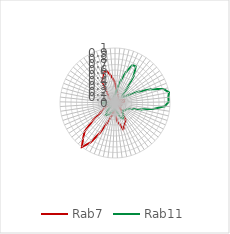
| Category | Rab7 | Rab11 |
|---|---|---|
| 0.0 | 0.37 | 0.139 |
| 0.10913 | 0.261 | 0.195 |
| 0.21825 | 0.221 | 0.298 |
| 0.32738 | 0.175 | 0.433 |
| 0.43651 | 0.157 | 0.603 |
| 0.54563 | 0.128 | 0.759 |
| 0.65476 | 0.121 | 0.767 |
| 0.76389 | 0.085 | 0.602 |
| 0.87302 | 0.066 | 0.363 |
| 0.98214 | 0.097 | 0.198 |
| 1.09127 | 0.088 | 0.164 |
| 1.2004 | 0.059 | 0.194 |
| 1.30952 | 0.069 | 0.29 |
| 1.41865 | 0.114 | 0.472 |
| 1.52778 | 0.144 | 0.701 |
| 1.6369 | 0.106 | 0.921 |
| 1.74603 | 0.183 | 1 |
| 1.85516 | 0.133 | 0.975 |
| 1.96429 | 0.093 | 0.975 |
| 2.07341 | 0.074 | 0.909 |
| 2.18254 | 0.068 | 0.713 |
| 2.29167 | 0.108 | 0.497 |
| 2.40079 | 0.135 | 0.343 |
| 2.50992 | 0.089 | 0.258 |
| 2.61905 | 0.086 | 0.242 |
| 2.72817 | 0.109 | 0.23 |
| 2.8373 | 0.087 | 0.217 |
| 2.94643 | 0.116 | 0.198 |
| 3.05556 | 0.121 | 0.203 |
| 3.16468 | 0.229 | 0.234 |
| 3.27381 | 0.364 | 0.29 |
| 3.38294 | 0.403 | 0.316 |
| 3.49206 | 0.448 | 0.288 |
| 3.60119 | 0.503 | 0.231 |
| 3.71032 | 0.391 | 0.17 |
| 3.81944 | 0.348 | 0.139 |
| 3.92857 | 0.233 | 0.117 |
| 4.0377 | 0.201 | 0.124 |
| 4.14683 | 0.127 | 0.113 |
| 4.25595 | 0.226 | 0.127 |
| 4.36508 | 0.274 | 0.151 |
| 4.47421 | 0.411 | 0.173 |
| 4.58333 | 0.624 | 0.232 |
| 4.69246 | 0.852 | 0.259 |
| 4.80159 | 1 | 0.274 |
| 4.91071 | 0.87 | 0.222 |
| 5.01984 | 0.757 | 0.149 |
| 5.12897 | 0.513 | 0.099 |
| 5.2381 | 0.313 | 0.079 |
| 5.34722 | 0.243 | 0.085 |
| 5.45635 | 0.2 | 0.114 |
| 5.56548 | 0.131 | 0.136 |
| 5.6746 | 0.131 | 0.132 |
| 5.78373 | 0.119 | 0.157 |
| 5.89286 | 0.07 | 0.211 |
| 6.00198 | 0.034 | 0.226 |
| 6.11111 | 0.016 | 0.169 |
| 6.22024 | 0 | 0.078 |
| 6.32937 | 0.029 | 0.022 |
| 6.43849 | 0.045 | 0.013 |
| 6.54762 | 0.028 | 0 |
| 6.65675 | 0.009 | 0.007 |
| 6.76587 | 0.075 | 0.027 |
| 6.875 | 0.157 | 0.032 |
| 6.98413 | 0.174 | 0.025 |
| 7.09325 | 0.192 | 0.04 |
| 7.20238 | 0.342 | 0.055 |
| 7.31151 | 0.471 | 0.09 |
| 7.42063 | 0.52 | 0.082 |
| 7.52976 | 0.601 | 0.086 |
| 7.63889 | 0.598 | 0.105 |
| 7.74802 | 0.524 | 0.119 |
| 7.85714 | 0.443 | 0.138 |